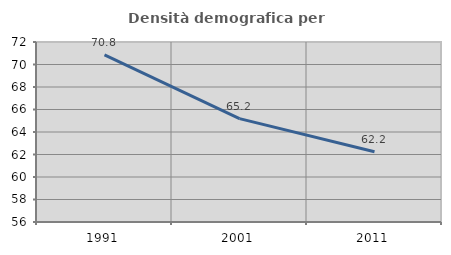
| Category | Densità demografica |
|---|---|
| 1991.0 | 70.848 |
| 2001.0 | 65.186 |
| 2011.0 | 62.245 |